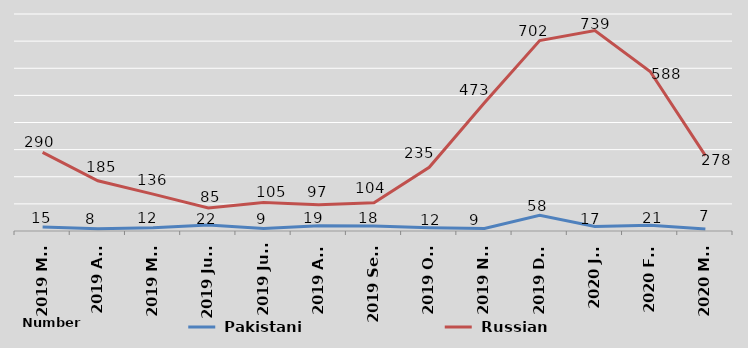
| Category |  Pakistani |  Russian |
|---|---|---|
| 2019 Mar | 15 | 290 |
| 2019 Apr | 8 | 185 |
| 2019 May | 12 | 136 |
| 2019 June | 22 | 85 |
| 2019 July | 9 | 105 |
| 2019 Aug | 19 | 97 |
| 2019 Sept | 18 | 104 |
| 2019 Oct | 12 | 235 |
| 2019 Nov | 9 | 473 |
| 2019 Dec | 58 | 702 |
| 2020 Jan | 17 | 739 |
| 2020 Feb | 21 | 588 |
| 2020 Mar | 7 | 278 |